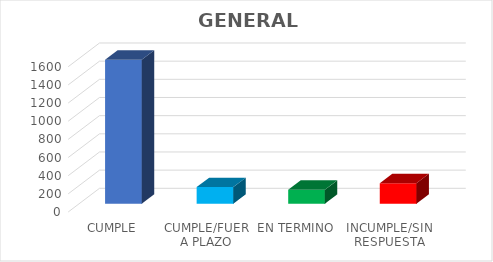
| Category | TOTAL |
|---|---|
| CUMPLE | 1585 |
| CUMPLE/FUERA PLAZO | 183 |
| EN TERMINO | 153 |
| INCUMPLE/SIN RESPUESTA | 225 |